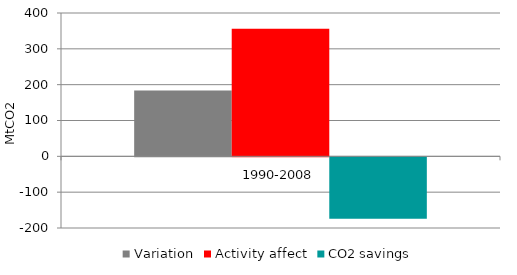
| Category | Variation | Activity affect | CO2 savings |
|---|---|---|---|
| 1990-2008 | 183.684 | 356.26 | -171.336 |